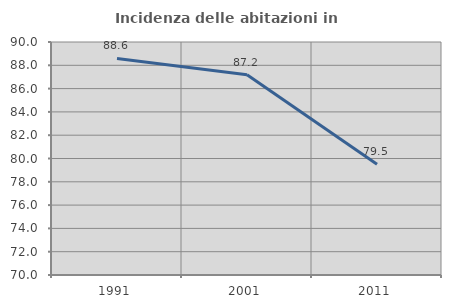
| Category | Incidenza delle abitazioni in proprietà  |
|---|---|
| 1991.0 | 88.593 |
| 2001.0 | 87.179 |
| 2011.0 | 79.514 |